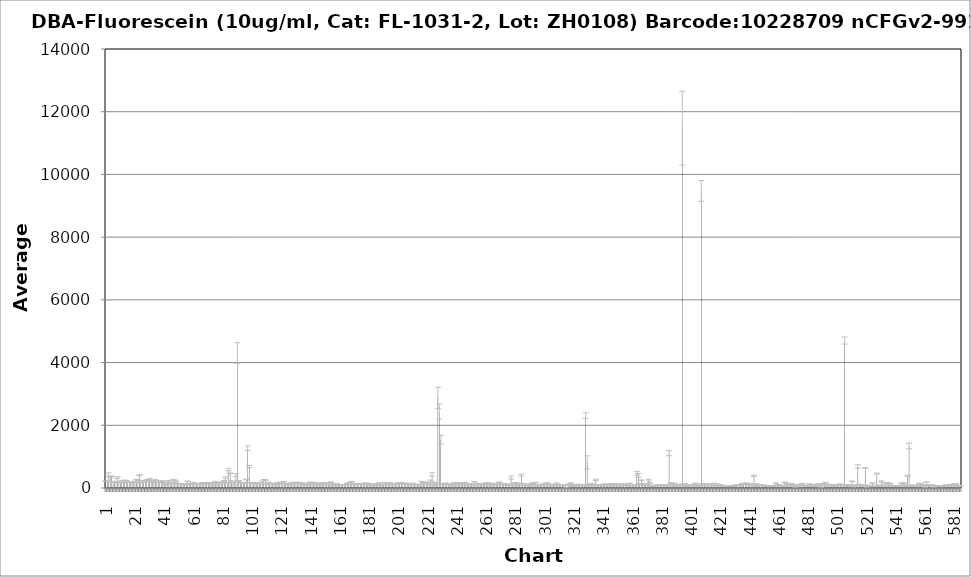
| Category | Average RFU |
|---|---|
| 1.0 | 218.25 |
| 2.0 | 205.25 |
| 3.0 | 427.25 |
| 4.0 | 367.75 |
| 5.0 | 365 |
| 6.0 | 198.5 |
| 7.0 | 209.5 |
| 8.0 | 181.5 |
| 9.0 | 329.75 |
| 10.0 | 183.25 |
| 11.0 | 175.25 |
| 12.0 | 215.75 |
| 13.0 | 171.5 |
| 14.0 | 244.25 |
| 15.0 | 224.5 |
| 16.0 | 201.5 |
| 17.0 | 189.25 |
| 18.0 | 188.75 |
| 19.0 | 163 |
| 20.0 | 170.25 |
| 21.0 | 206.5 |
| 22.0 | 246.75 |
| 23.0 | 251 |
| 24.0 | 409 |
| 25.0 | 167.25 |
| 26.0 | 201.25 |
| 27.0 | 232 |
| 28.0 | 230.25 |
| 29.0 | 246.5 |
| 30.0 | 221.25 |
| 31.0 | 290 |
| 32.0 | 175 |
| 33.0 | 229.25 |
| 34.0 | 195.5 |
| 35.0 | 248.75 |
| 36.0 | 198.25 |
| 37.0 | 213.5 |
| 38.0 | 201.5 |
| 39.0 | 188 |
| 40.0 | 220 |
| 41.0 | 107.5 |
| 42.0 | 153.25 |
| 43.0 | 151 |
| 44.0 | 229.5 |
| 45.0 | 169 |
| 46.0 | 159 |
| 47.0 | 254.25 |
| 48.0 | 247.75 |
| 49.0 | 190.25 |
| 50.0 | 137.5 |
| 51.0 | 139.5 |
| 52.0 | 139.25 |
| 53.0 | 132.5 |
| 54.0 | 125.75 |
| 55.0 | 117.25 |
| 56.0 | 125.75 |
| 57.0 | 214.5 |
| 58.0 | 136 |
| 59.0 | 125 |
| 60.0 | 146.75 |
| 61.0 | 166.25 |
| 62.0 | 143.25 |
| 63.0 | 141.5 |
| 64.0 | 118.75 |
| 65.0 | 121 |
| 66.0 | 113.25 |
| 67.0 | 164 |
| 68.0 | 166.75 |
| 69.0 | 125.25 |
| 70.0 | 153.25 |
| 71.0 | 149.25 |
| 72.0 | 164.75 |
| 73.0 | 130.75 |
| 74.0 | 153.25 |
| 75.0 | 160.5 |
| 76.0 | 204 |
| 77.0 | 120.5 |
| 78.0 | 165.75 |
| 79.0 | 156.75 |
| 80.0 | 186.75 |
| 81.0 | 147.25 |
| 82.0 | 223.5 |
| 83.0 | 334 |
| 84.0 | 160.75 |
| 85.0 | 588 |
| 86.0 | 467 |
| 87.0 | 210.75 |
| 88.0 | 131.75 |
| 89.0 | 205.5 |
| 90.0 | 410.25 |
| 91.0 | 4305 |
| 92.0 | 223.75 |
| 93.0 | 165.75 |
| 94.0 | 152.75 |
| 95.0 | 146.5 |
| 96.0 | 167.75 |
| 97.0 | 273.25 |
| 98.0 | 1267.75 |
| 99.0 | 683 |
| 100.0 | 167 |
| 101.0 | 166 |
| 102.0 | 162.25 |
| 103.0 | 125.5 |
| 104.0 | 162.25 |
| 105.0 | 149 |
| 106.0 | 131 |
| 107.0 | 147 |
| 108.0 | 210.75 |
| 109.0 | 264.5 |
| 110.0 | 258 |
| 111.0 | 125.25 |
| 112.0 | 174.25 |
| 113.0 | 150.25 |
| 114.0 | 143.25 |
| 115.0 | 140.5 |
| 116.0 | 134.75 |
| 117.0 | 115 |
| 118.0 | 143.75 |
| 119.0 | 171 |
| 120.0 | 141.5 |
| 121.0 | 168.25 |
| 122.0 | 143.25 |
| 123.0 | 203.75 |
| 124.0 | 131 |
| 125.0 | 143.5 |
| 126.0 | 115.5 |
| 127.0 | 128.75 |
| 128.0 | 157.75 |
| 129.0 | 170.75 |
| 130.0 | 142.5 |
| 131.0 | 160.25 |
| 132.0 | 174.25 |
| 133.0 | 175 |
| 134.0 | 113.25 |
| 135.0 | 165.75 |
| 136.0 | 109.25 |
| 137.0 | 127 |
| 138.0 | 96.75 |
| 139.0 | 147 |
| 140.0 | 112 |
| 141.0 | 182.5 |
| 142.0 | 169 |
| 143.0 | 121.25 |
| 144.0 | 127.5 |
| 145.0 | 158 |
| 146.0 | 149.25 |
| 147.0 | 99.5 |
| 148.0 | 107.5 |
| 149.0 | 157.75 |
| 150.0 | 167.25 |
| 151.0 | 123 |
| 152.0 | 157.25 |
| 153.0 | 145.25 |
| 154.0 | 106.75 |
| 155.0 | 188 |
| 156.0 | 118.75 |
| 157.0 | 107.25 |
| 158.0 | 136.75 |
| 159.0 | 139.25 |
| 160.0 | 102.75 |
| 161.0 | 100.5 |
| 162.0 | 94.75 |
| 163.0 | 104.75 |
| 164.0 | 103.25 |
| 165.0 | 105.5 |
| 166.0 | 138.5 |
| 167.0 | 157.75 |
| 168.0 | 146.25 |
| 169.0 | 198.25 |
| 170.0 | 121 |
| 171.0 | 121.5 |
| 172.0 | 114 |
| 173.0 | 126.5 |
| 174.0 | 116.25 |
| 175.0 | 140.25 |
| 176.0 | 117 |
| 177.0 | 105.25 |
| 178.0 | 143 |
| 179.0 | 155 |
| 180.0 | 106.5 |
| 181.0 | 138 |
| 182.0 | 93.25 |
| 183.0 | 98.25 |
| 184.0 | 82.5 |
| 185.0 | 121.25 |
| 186.0 | 132.5 |
| 187.0 | 136.25 |
| 188.0 | 158.5 |
| 189.0 | 109.75 |
| 190.0 | 107 |
| 191.0 | 99.5 |
| 192.0 | 174 |
| 193.0 | 112.75 |
| 194.0 | 131.75 |
| 195.0 | 168.5 |
| 196.0 | 132.25 |
| 197.0 | 140.75 |
| 198.0 | 126.25 |
| 199.0 | 121.75 |
| 200.0 | 134.5 |
| 201.0 | 157 |
| 202.0 | 135.25 |
| 203.0 | 174.5 |
| 204.0 | 146 |
| 205.0 | 148 |
| 206.0 | 134 |
| 207.0 | 114 |
| 208.0 | 135 |
| 209.0 | 115.25 |
| 210.0 | 114 |
| 211.0 | 143 |
| 212.0 | 119 |
| 213.0 | 103.25 |
| 214.0 | 106 |
| 215.0 | 118.25 |
| 216.0 | 92.5 |
| 217.0 | 202.75 |
| 218.0 | 153.75 |
| 219.0 | 187.25 |
| 220.0 | 165.25 |
| 221.0 | 148 |
| 222.0 | 125.25 |
| 223.0 | 240 |
| 224.0 | 430.25 |
| 225.0 | 113.25 |
| 226.0 | 175.75 |
| 227.0 | 122.25 |
| 228.0 | 2871.5 |
| 229.0 | 2438.25 |
| 230.0 | 1542.25 |
| 231.0 | 104.75 |
| 232.0 | 139 |
| 233.0 | 147.25 |
| 234.0 | 117.5 |
| 235.0 | 114.25 |
| 236.0 | 125.5 |
| 237.0 | 112 |
| 238.0 | 100.75 |
| 239.0 | 160 |
| 240.0 | 113 |
| 241.0 | 153.75 |
| 242.0 | 156.75 |
| 243.0 | 116.25 |
| 244.0 | 102.5 |
| 245.0 | 154.25 |
| 246.0 | 158.25 |
| 247.0 | 154.5 |
| 248.0 | 104.75 |
| 249.0 | 127.5 |
| 250.0 | 123.5 |
| 251.0 | 120.5 |
| 252.0 | 104 |
| 253.0 | 197 |
| 254.0 | 100.75 |
| 255.0 | 134.25 |
| 256.0 | 126.25 |
| 257.0 | 95.75 |
| 258.0 | 129.75 |
| 259.0 | 116.75 |
| 260.0 | 92.5 |
| 261.0 | 158.5 |
| 262.0 | 106.75 |
| 263.0 | 153.25 |
| 264.0 | 99.25 |
| 265.0 | 145.75 |
| 266.0 | 110 |
| 267.0 | 110.75 |
| 268.0 | 132.75 |
| 269.0 | 102.75 |
| 270.0 | 186 |
| 271.0 | 132.75 |
| 272.0 | 104.5 |
| 273.0 | 131.75 |
| 274.0 | 125 |
| 275.0 | 107.25 |
| 276.0 | 104.75 |
| 277.0 | 119.5 |
| 278.0 | 331.5 |
| 279.0 | 105.5 |
| 280.0 | 167.25 |
| 281.0 | 162.75 |
| 282.0 | 107.25 |
| 283.0 | 148.25 |
| 284.0 | 83 |
| 285.0 | 409.5 |
| 286.0 | 144.5 |
| 287.0 | 135 |
| 288.0 | 100.25 |
| 289.0 | 109 |
| 290.0 | 83.25 |
| 291.0 | 83 |
| 292.0 | 143.75 |
| 293.0 | 162 |
| 294.0 | 114.5 |
| 295.0 | 177.5 |
| 296.0 | 92.25 |
| 297.0 | 101.5 |
| 298.0 | 82.75 |
| 299.0 | 113.75 |
| 300.0 | 121.5 |
| 301.0 | 107 |
| 302.0 | 155 |
| 303.0 | 148.5 |
| 304.0 | 90.75 |
| 305.0 | 110 |
| 306.0 | 94 |
| 307.0 | 93.75 |
| 308.0 | 99 |
| 309.0 | 148.25 |
| 310.0 | 97.5 |
| 311.0 | 84.5 |
| 312.0 | 91.25 |
| 313.0 | 86.75 |
| 314.0 | 85 |
| 315.0 | 91 |
| 316.0 | 3.5 |
| 317.0 | 92 |
| 318.0 | 126.25 |
| 319.0 | 154.75 |
| 320.0 | 77.75 |
| 321.0 | 92.5 |
| 322.0 | 95.75 |
| 323.0 | 102.5 |
| 324.0 | 116 |
| 325.0 | 108.75 |
| 326.0 | 89.25 |
| 327.0 | 95.5 |
| 328.0 | 75.25 |
| 329.0 | 2309.75 |
| 330.0 | 814.75 |
| 331.0 | 114 |
| 332.0 | 80.5 |
| 333.0 | 136 |
| 334.0 | 113 |
| 335.0 | 102.75 |
| 336.0 | 257.75 |
| 337.0 | 106.75 |
| 338.0 | 105 |
| 339.0 | 91 |
| 340.0 | 95.25 |
| 341.0 | 94.25 |
| 342.0 | 115 |
| 343.0 | 90.5 |
| 344.0 | 84.5 |
| 345.0 | 92.75 |
| 346.0 | 131.25 |
| 347.0 | 100.5 |
| 348.0 | 104.5 |
| 349.0 | 129.25 |
| 350.0 | 119.5 |
| 351.0 | 80 |
| 352.0 | 125.25 |
| 353.0 | 92.75 |
| 354.0 | 108.25 |
| 355.0 | 120.75 |
| 356.0 | 115 |
| 357.0 | 86.75 |
| 358.0 | 81.25 |
| 359.0 | 149.25 |
| 360.0 | 85.5 |
| 361.0 | 84 |
| 362.0 | 91.5 |
| 363.0 | 85.5 |
| 364.0 | 465.5 |
| 365.0 | 402 |
| 366.0 | 133.75 |
| 367.0 | 249.75 |
| 368.0 | 106.5 |
| 369.0 | 132.25 |
| 370.0 | 84.25 |
| 371.0 | 92.5 |
| 372.0 | 250.5 |
| 373.0 | 159 |
| 374.0 | 81.25 |
| 375.0 | 79.5 |
| 376.0 | 63.75 |
| 377.0 | 75 |
| 378.0 | 94.5 |
| 379.0 | 86.75 |
| 380.0 | 79 |
| 381.0 | 84.5 |
| 382.0 | 89 |
| 383.0 | 101.75 |
| 384.0 | 87.5 |
| 385.0 | 76.5 |
| 386.0 | 1111.25 |
| 387.0 | 155.75 |
| 388.0 | 118 |
| 389.0 | 151.75 |
| 390.0 | 76.75 |
| 391.0 | 86.5 |
| 392.0 | 82 |
| 393.0 | 121.25 |
| 394.0 | 99.75 |
| 395.0 | 11473.75 |
| 396.0 | 99.5 |
| 397.0 | 130 |
| 398.0 | 67.75 |
| 399.0 | 76.75 |
| 400.0 | 85.5 |
| 401.0 | 88.25 |
| 402.0 | 98.5 |
| 403.0 | 84.25 |
| 404.0 | 141.75 |
| 405.0 | 116 |
| 406.0 | 71 |
| 407.0 | 81.5 |
| 408.0 | 9475.25 |
| 409.0 | 125.5 |
| 410.0 | 93.25 |
| 411.0 | 126.5 |
| 412.0 | 123.75 |
| 413.0 | 124.5 |
| 414.0 | 102.25 |
| 415.0 | 99.25 |
| 416.0 | 78.75 |
| 417.0 | 144.25 |
| 418.0 | 74.25 |
| 419.0 | 122.5 |
| 420.0 | 92.5 |
| 421.0 | 105 |
| 422.0 | 64 |
| 423.0 | 67 |
| 424.0 | 58.25 |
| 425.0 | 75.5 |
| 426.0 | 74.5 |
| 427.0 | 64.5 |
| 428.0 | 71 |
| 429.0 | 59.75 |
| 430.0 | 64.25 |
| 431.0 | 57.5 |
| 432.0 | 98.5 |
| 433.0 | 50.5 |
| 434.0 | 93.75 |
| 435.0 | 117.5 |
| 436.0 | 127.25 |
| 437.0 | 143.25 |
| 438.0 | 114.75 |
| 439.0 | 154.25 |
| 440.0 | 120.25 |
| 441.0 | 131.25 |
| 442.0 | 84.75 |
| 443.0 | 80 |
| 444.0 | 390 |
| 445.0 | 135.25 |
| 446.0 | 78.75 |
| 447.0 | 102.25 |
| 448.0 | 82 |
| 449.0 | 87.5 |
| 450.0 | 87.75 |
| 451.0 | 82.25 |
| 452.0 | 72.75 |
| 453.0 | 60.5 |
| 454.0 | 67.5 |
| 455.0 | 62.5 |
| 456.0 | 72 |
| 457.0 | 68.25 |
| 458.0 | 73.25 |
| 459.0 | 149.5 |
| 460.0 | 84.75 |
| 461.0 | 103 |
| 462.0 | 82.25 |
| 463.0 | 76 |
| 464.0 | 69 |
| 465.0 | 178.25 |
| 466.0 | 142.5 |
| 467.0 | 129.5 |
| 468.0 | 122.5 |
| 469.0 | 69.75 |
| 470.0 | 131.75 |
| 471.0 | 79.5 |
| 472.0 | 66 |
| 473.0 | 87 |
| 474.0 | 102.75 |
| 475.0 | 102.75 |
| 476.0 | 114.5 |
| 477.0 | 142.25 |
| 478.0 | 85.75 |
| 479.0 | 68.25 |
| 480.0 | 78.25 |
| 481.0 | 70.75 |
| 482.0 | 123 |
| 483.0 | 79.75 |
| 484.0 | 108.5 |
| 485.0 | 66.25 |
| 486.0 | 88 |
| 487.0 | 73.5 |
| 488.0 | 137.5 |
| 489.0 | 115.25 |
| 490.0 | 51 |
| 491.0 | 92 |
| 492.0 | 143.25 |
| 493.0 | 173.75 |
| 494.0 | 82 |
| 495.0 | 104.75 |
| 496.0 | 113.25 |
| 497.0 | 103.5 |
| 498.0 | 86 |
| 499.0 | 69.25 |
| 500.0 | 65 |
| 501.0 | 81.75 |
| 502.0 | 111.5 |
| 503.0 | 119.5 |
| 504.0 | 104 |
| 505.0 | 104.75 |
| 506.0 | 4701.75 |
| 507.0 | 103 |
| 508.0 | 74.5 |
| 509.0 | 92.25 |
| 510.0 | 81.75 |
| 511.0 | 216 |
| 512.0 | 64.75 |
| 513.0 | 67 |
| 514.0 | 84 |
| 515.0 | 687.25 |
| 516.0 | 113 |
| 517.0 | 85.75 |
| 518.0 | 68.75 |
| 519.0 | 83.75 |
| 520.0 | 638.5 |
| 521.0 | 56.5 |
| 522.0 | 60.75 |
| 523.0 | 61.25 |
| 524.0 | 61 |
| 525.0 | 153 |
| 526.0 | 67.5 |
| 527.0 | 64.25 |
| 528.0 | 460.5 |
| 529.0 | 70.5 |
| 530.0 | 93.5 |
| 531.0 | 207.5 |
| 532.0 | 62.5 |
| 533.0 | 68.75 |
| 534.0 | 136.25 |
| 535.0 | 162.75 |
| 536.0 | 150.75 |
| 537.0 | 140.5 |
| 538.0 | 87 |
| 539.0 | 78 |
| 540.0 | 58.5 |
| 541.0 | 72.25 |
| 542.0 | 57.5 |
| 543.0 | 79.75 |
| 544.0 | 69.75 |
| 545.0 | 143.25 |
| 546.0 | 162.75 |
| 547.0 | 134.25 |
| 548.0 | 69.5 |
| 549.0 | 389 |
| 550.0 | 1339 |
| 551.0 | 61.25 |
| 552.0 | 91.5 |
| 553.0 | 63.5 |
| 554.0 | 78.25 |
| 555.0 | 78.5 |
| 556.0 | 79.5 |
| 557.0 | 129 |
| 558.0 | 145 |
| 559.0 | 70.75 |
| 560.0 | 100.25 |
| 561.0 | 51.5 |
| 562.0 | 186 |
| 563.0 | 94 |
| 564.0 | 95 |
| 565.0 | 96.5 |
| 566.0 | 100.75 |
| 567.0 | 42.5 |
| 568.0 | 57.5 |
| 569.0 | 64 |
| 570.0 | 67 |
| 571.0 | 66.5 |
| 572.0 | 31.5 |
| 573.0 | 78 |
| 574.0 | 82.25 |
| 575.0 | 79 |
| 576.0 | 92.5 |
| 577.0 | 78 |
| 578.0 | 111.75 |
| 579.0 | 70.25 |
| 580.0 | 88.75 |
| 581.0 | 128.25 |
| 582.0 | 123.75 |
| 583.0 | 82.5 |
| 584.0 | 62.75 |
| 585.0 | 69.5 |